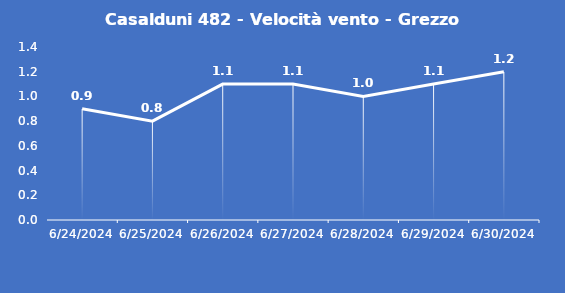
| Category | Casalduni 482 - Velocità vento - Grezzo (m/s) |
|---|---|
| 6/24/24 | 0.9 |
| 6/25/24 | 0.8 |
| 6/26/24 | 1.1 |
| 6/27/24 | 1.1 |
| 6/28/24 | 1 |
| 6/29/24 | 1.1 |
| 6/30/24 | 1.2 |